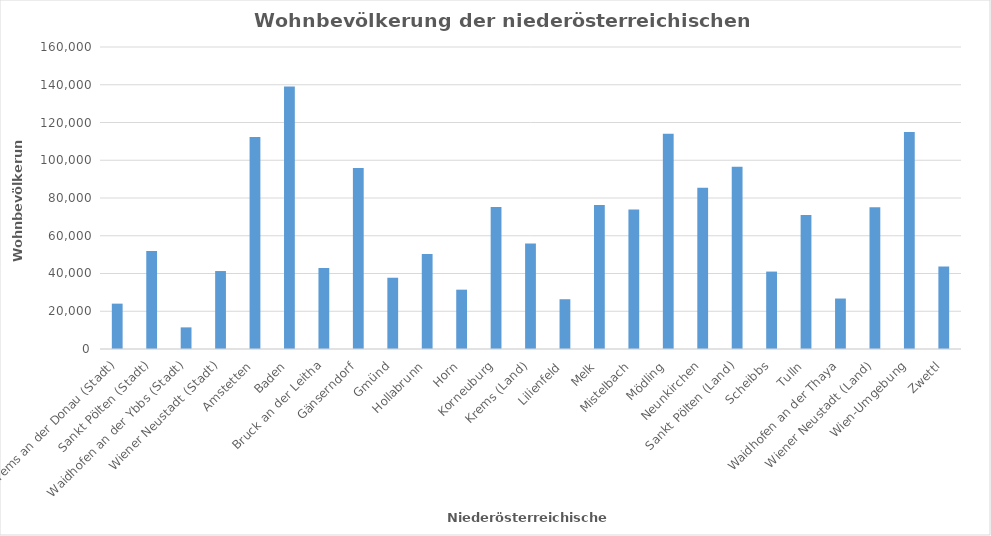
| Category | Series 0 |
|---|---|
| Krems an der Donau (Stadt) | 24032 |
| Sankt Pölten (Stadt) | 51955 |
| Waidhofen an der Ybbs (Stadt) | 11455 |
| Wiener Neustadt (Stadt) | 41305 |
| Amstetten | 112355 |
| Baden | 139039 |
|  Bruck an der Leitha | 42910 |
| Gänserndorf | 95841 |
| Gmünd | 37761 |
| Hollabrunn | 50301 |
| Horn | 31429 |
| Korneuburg | 75281 |
| Krems (Land) | 55874 |
| Lilienfeld | 26369 |
| Melk | 76344 |
| Mistelbach | 73962 |
| Mödling | 114086 |
| Neunkirchen | 85460 |
| Sankt Pölten (Land) | 96522 |
| Scheibbs | 41020 |
| Tulln | 70963 |
| Waidhofen an der Thaya | 26738 |
| Wiener Neustadt (Land) | 75064 |
| Wien-Umgebung | 114920 |
| Zwettl | 43707 |